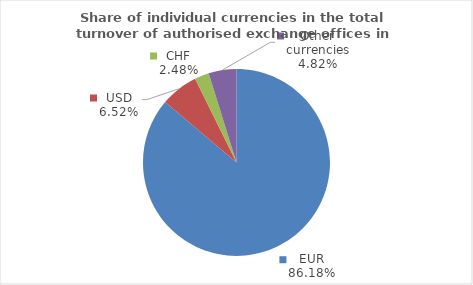
| Category | Series 0 |
|---|---|
| EUR | 86.182 |
| USD | 6.515 |
| CHF | 2.483 |
| Other currencies | 4.819 |